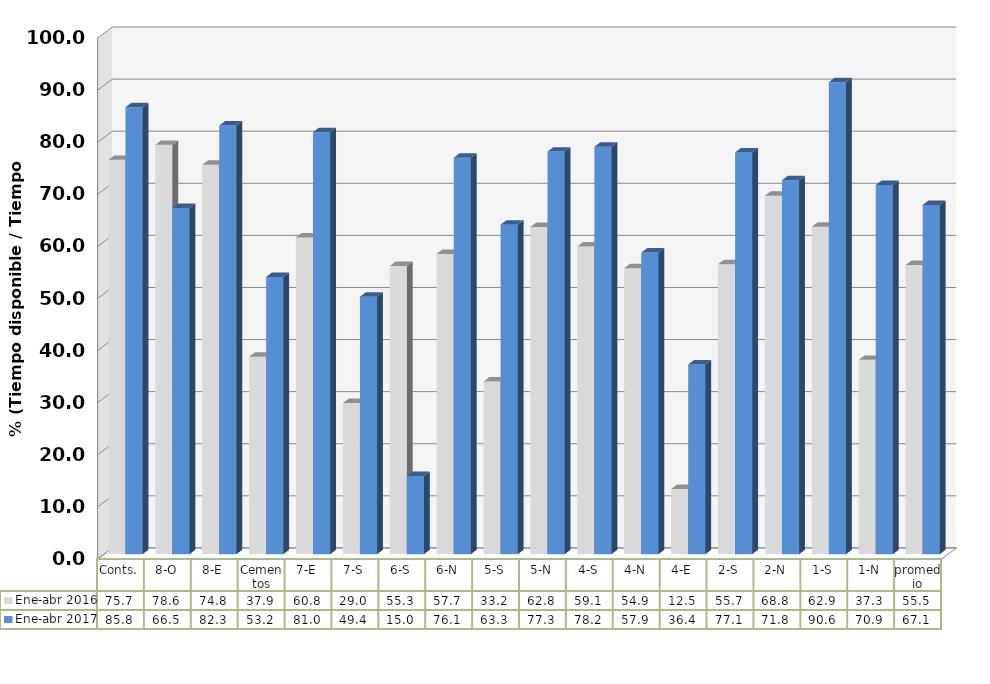
| Category | Ene-abr 2016 | Ene-abr 2017 |
|---|---|---|
| Conts. | 75.71 | 85.805 |
| 8-O | 78.583 | 66.464 |
| 8-E | 74.754 | 82.295 |
| Cementos | 37.897 | 53.239 |
| 7-E | 60.822 | 81.015 |
| 7-S | 29.021 | 49.442 |
| 6-S | 55.325 | 15.034 |
| 6-N | 57.653 | 76.117 |
| 5-S | 33.151 | 63.265 |
| 5-N | 62.831 | 77.29 |
| 4-S | 59.072 | 78.228 |
| 4-N | 54.907 | 57.909 |
| 4-E | 12.511 | 36.422 |
| 2-S | 55.656 | 77.13 |
| 2-N | 68.826 | 71.79 |
| 1-S | 62.866 | 90.623 |
| 1-N | 37.314 | 70.879 |
| promedio | 55.51 | 67.056 |